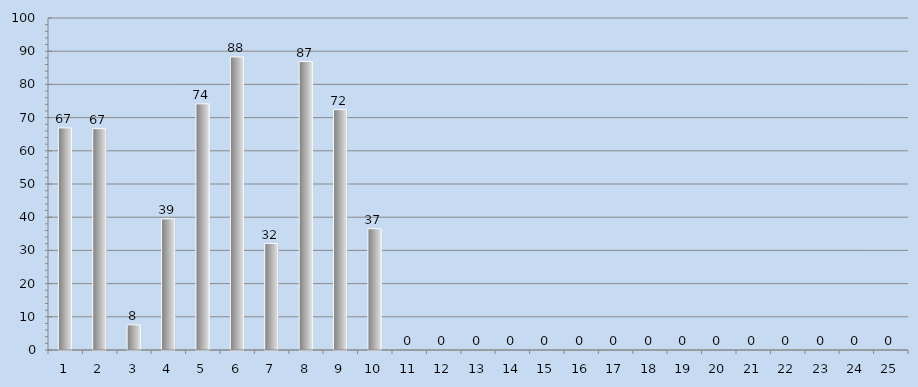
| Category | Series 0 |
|---|---|
| 0 | 66.897 |
| 1 | 66.667 |
| 2 | 7.586 |
| 3 | 39.483 |
| 4 | 74.138 |
| 5 | 88.276 |
| 6 | 32.069 |
| 7 | 86.897 |
| 8 | 72.414 |
| 9 | 36.552 |
| 10 | 0 |
| 11 | 0 |
| 12 | 0 |
| 13 | 0 |
| 14 | 0 |
| 15 | 0 |
| 16 | 0 |
| 17 | 0 |
| 18 | 0 |
| 19 | 0 |
| 20 | 0 |
| 21 | 0 |
| 22 | 0 |
| 23 | 0 |
| 24 | 0 |